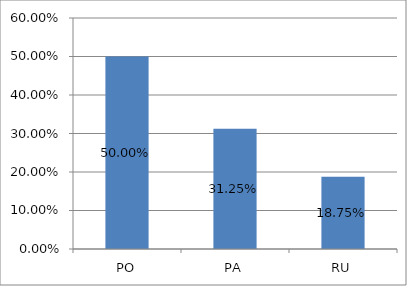
| Category | Series 0 |
|---|---|
| PO | 0.5 |
| PA | 0.312 |
| RU | 0.188 |